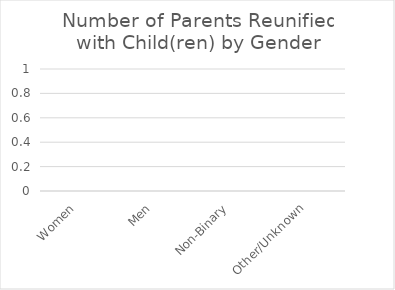
| Category | Reunified |
|---|---|
| Women | 0 |
| Men | 0 |
| Non-Binary | 0 |
| Other/Unknown | 0 |